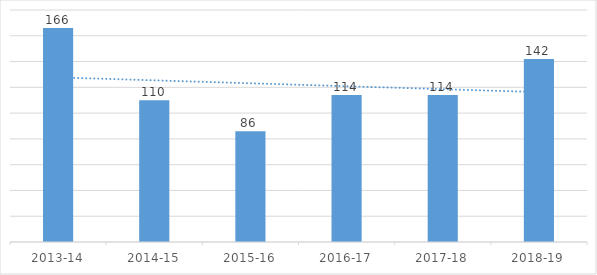
| Category | Series 0 |
|---|---|
| 2013-14 | 166 |
| 2014-15 | 110 |
| 2015-16 | 86 |
| 2016-17 | 114 |
| 2017-18 | 114 |
| 2018-19 | 142 |